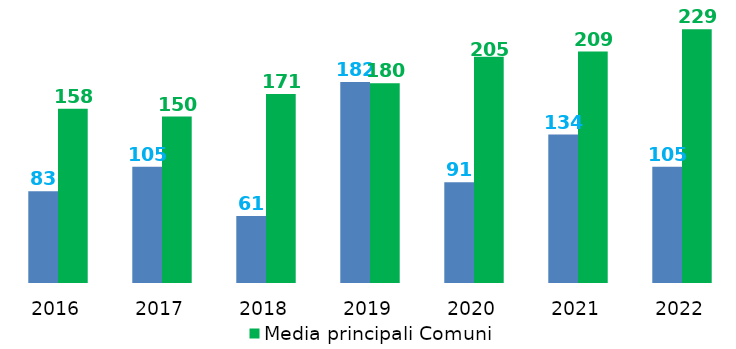
| Category | Investimenti complessivi procapite | Media principali Comuni |
|---|---|---|
| 2016.0 | 82.944 | 157.517 |
| 2017.0 | 105.047 | 150.444 |
| 2018.0 | 60.65 | 170.92 |
| 2019.0 | 181.69 | 180.492 |
| 2020.0 | 91.04 | 204.57 |
| 2021.0 | 134.131 | 209.213 |
| 2022.0 | 105.05 | 229.386 |